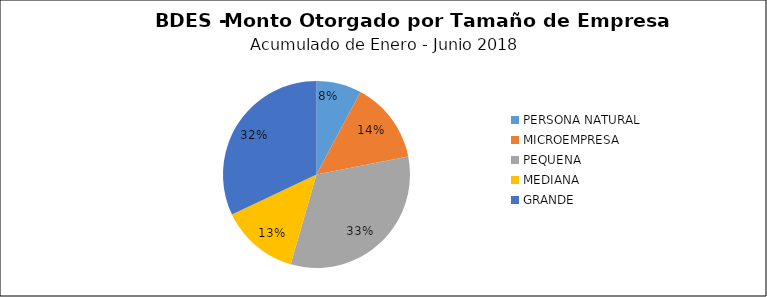
| Category | Monto | Créditos |
|---|---|---|
| PERSONA NATURAL | 6.83 | 446 |
| MICROEMPRESA | 12.354 | 1954 |
| PEQUENA | 28.509 | 399 |
| MEDIANA | 11.855 | 81 |
| GRANDE | 28.044 | 76 |